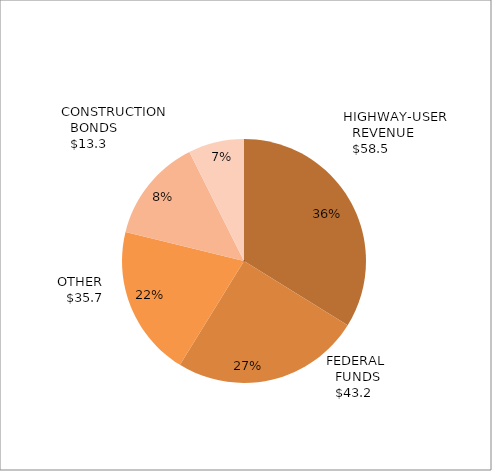
| Category | Series 0 | Data C |
|---|---|---|
| 0 | 56.168 | 0 |
| 1 | 41.423 | 0 |
| 2 | 33.26 | 0 |
| 3 | 22.867 | 0 |
| 4 | 12.264 | 0 |